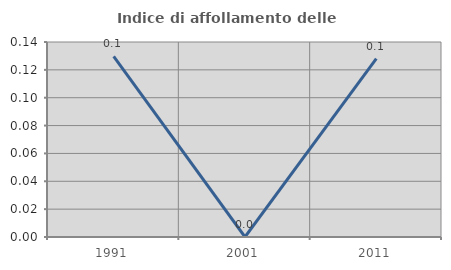
| Category | Indice di affollamento delle abitazioni  |
|---|---|
| 1991.0 | 0.13 |
| 2001.0 | 0 |
| 2011.0 | 0.128 |